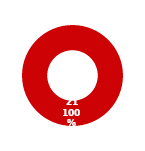
| Category | RESPONSE |
|---|---|
| MIL 2 Complete | 0 |
| MIL 2 Not Complete | 21 |